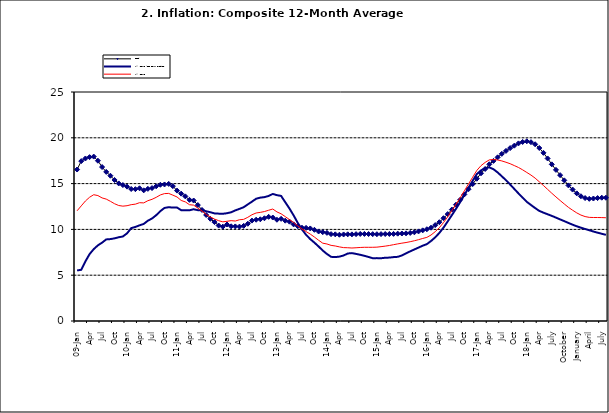
| Category | Food | All Items less Farm Produce | All Items |
|---|---|---|---|
| 09-Jan | 16.536 | 5.519 | 12.032 |
| Feb | 17.454 | 5.591 | 12.567 |
| Mar | 17.742 | 6.51 | 13.101 |
| Apr | 17.89 | 7.302 | 13.51 |
| May | 17.949 | 7.847 | 13.787 |
| June | 17.498 | 8.259 | 13.694 |
| Jul | 16.808 | 8.554 | 13.437 |
| Aug | 16.278 | 8.906 | 13.307 |
| Sep | 15.859 | 8.942 | 13.065 |
| Oct | 15.396 | 9.024 | 12.803 |
| Nov | 15.018 | 9.143 | 12.609 |
| Dec | 14.841 | 9.226 | 12.538 |
| 10-Jan | 14.668 | 9.567 | 12.586 |
| Feb | 14.411 | 10.138 | 12.7 |
| Mar | 14.395 | 10.269 | 12.757 |
| Apr | 14.489 | 10.444 | 12.915 |
| May | 14.266 | 10.597 | 12.893 |
| Jun | 14.424 | 10.948 | 13.132 |
| Jul | 14.514 | 11.193 | 13.284 |
| Aug | 14.706 | 11.549 | 13.5 |
| Sep | 14.872 | 11.997 | 13.764 |
| Oct | 14.906 | 12.345 | 13.908 |
| Nov | 14.967 | 12.423 | 13.928 |
| Dec | 14.723 | 12.383 | 13.74 |
| 11-Jan | 14.233 | 12.385 | 13.542 |
| Feb | 13.903 | 12.099 | 13.161 |
| Mar | 13.606 | 12.077 | 13.001 |
| Apr | 13.227 | 12.088 | 12.694 |
| May | 13.152 | 12.198 | 12.648 |
| Jun | 12.654 | 12.1 | 12.321 |
| Jul | 12.118 | 12.109 | 12.009 |
| Aug | 11.575 | 11.98 | 11.635 |
| Sep | 11.155 | 11.877 | 11.363 |
| Oct | 10.797 | 11.746 | 11.13 |
| Nov | 10.422 | 11.721 | 10.952 |
| Dec | 10.298 | 11.706 | 10.826 |
| 12-Jan | 10.538 | 11.765 | 10.886 |
| 12-Feb | 10.336 | 11.872 | 10.955 |
| 12-Mar | 10.325 | 12.075 | 10.914 |
| Apr | 10.304 | 12.242 | 11.054 |
| May | 10.387 | 12.419 | 11.096 |
| Jun | 10.617 | 12.732 | 11.32 |
| Jul | 10.963 | 13.032 | 11.599 |
| Aug | 11.056 | 13.349 | 11.791 |
| Sep | 11.104 | 13.467 | 11.859 |
| Oct | 11.216 | 13.525 | 11.948 |
| Nov | 11.372 | 13.649 | 12.091 |
| Dec | 11.296 | 13.873 | 12.224 |
| 13-Jan | 11.055 | 13.737 | 11.908 |
| Feb | 11.153 | 13.657 | 11.703 |
| Mar | 10.951 | 12.963 | 11.394 |
| Apr | 10.844 | 12.281 | 11.072 |
| May | 10.548 | 11.531 | 10.761 |
| Jun | 10.352 | 10.704 | 10.383 |
| Jul | 10.186 | 10.005 | 10.047 |
| Aug | 10.168 | 9.4 | 9.761 |
| Sep | 10.105 | 8.939 | 9.486 |
| Oct | 9.955 | 8.553 | 9.167 |
| Nov | 9.774 | 8.136 | 8.815 |
| Dec | 9.695 | 7.691 | 8.496 |
| 14-Jan | 9.626 | 7.317 | 8.408 |
| Feb | 9.484 | 7.005 | 8.257 |
| Mar | 9.464 | 6.976 | 8.19 |
| Apr | 9.416 | 7.03 | 8.092 |
| May | 9.448 | 7.151 | 8.012 |
| Jun | 9.464 | 7.369 | 7.998 |
| Jul | 9.459 | 7.411 | 7.968 |
| Aug | 9.481 | 7.325 | 7.996 |
| Sep | 9.501 | 7.228 | 8.027 |
| Oct | 9.508 | 7.116 | 8.047 |
| Nov | 9.492 | 6.991 | 8.046 |
| Dec | 9.481 | 6.854 | 8.047 |
| 15-Jan | 9.475 | 6.865 | 8.063 |
| Feb | 9.486 | 6.852 | 8.117 |
| Mar | 9.495 | 6.905 | 8.176 |
| Apr | 9.501 | 6.922 | 8.243 |
| May | 9.51 | 6.975 | 8.331 |
| Jun | 9.535 | 7.006 | 8.417 |
| Jul | 9.552 | 7.154 | 8.497 |
| Aug | 9.571 | 7.384 | 8.566 |
| Sep | 9.614 | 7.605 | 8.658 |
| Oct | 9.68 | 7.812 | 8.76 |
| Nov | 9.778 | 8.016 | 8.879 |
| Dec | 9.898 | 8.222 | 9.009 |
| 16-Jan | 10.017 | 8.391 | 9.13 |
| Feb | 10.184 | 8.732 | 9.386 |
| Mar | 10.471 | 9.132 | 9.751 |
| Apr | 10.786 | 9.614 | 10.182 |
| May | 11.221 | 10.196 | 10.746 |
| Jun | 11.672 | 10.864 | 11.372 |
| Jul | 12.162 | 11.553 | 12.045 |
| Aug | 12.696 | 12.247 | 12.744 |
| Sep | 13.238 | 12.98 | 13.454 |
| Oct | 13.817 | 13.757 | 14.206 |
| Nov | 14.386 | 14.542 | 14.958 |
| Dec | 14.946 | 15.307 | 15.697 |
| 17-Jan | 15.536 | 16.042 | 16.441 |
| Feb | 16.127 | 16.436 | 16.958 |
| Mar | 16.598 | 16.682 | 17.315 |
| Apr | 17.106 | 16.772 | 17.591 |
| May | 17.477 | 16.567 | 17.628 |
| Jun | 17.868 | 16.219 | 17.578 |
| Jul | 18.247 | 15.798 | 17.475 |
| Aug | 18.569 | 15.372 | 17.331 |
| Sep | 18.876 | 14.903 | 17.17 |
| Oct | 19.14 | 14.415 | 16.968 |
| Nov | 19.392 | 13.93 | 16.76 |
| Dec | 19.546 | 13.458 | 16.502 |
| 18-Jan | 19.621 | 13.01 | 16.215 |
| Feb | 19.521 | 12.668 | 15.93 |
| Mar | 19.294 | 12.33 | 15.599 |
| Apr | 18.886 | 12.021 | 15.196 |
| May | 18.359 | 11.828 | 14.793 |
| June | 17.745 | 11.651 | 14.371 |
| July | 17.102 | 11.478 | 13.95 |
| August | 16.501 | 11.285 | 13.546 |
| September | 15.923 | 11.092 | 13.157 |
| October | 15.355 | 10.903 | 12.777 |
| November | 14.802 | 10.703 | 12.406 |
| December | 14.348 | 10.514 | 12.095 |
| January | 13.934 | 10.339 | 11.801 |
| February | 13.62 | 10.185 | 11.564 |
| March | 13.42 | 10.044 | 11.401 |
| April | 13.339 | 9.909 | 11.314 |
| May | 13.371 | 9.77 | 11.299 |
| June | 13.418 | 9.64 | 11.297 |
| July | 13.46 | 9.524 | 11.291 |
| August | 13.458 | 9.411 | 11.271 |